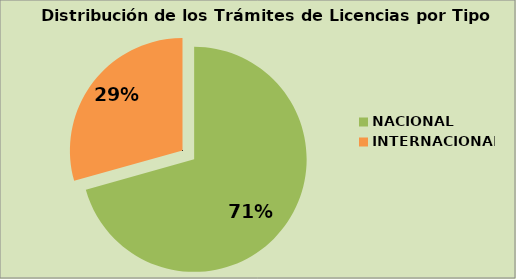
| Category | Series 0 |
|---|---|
| NACIONAL | 70.651 |
| INTERNACIONAL | 29.349 |